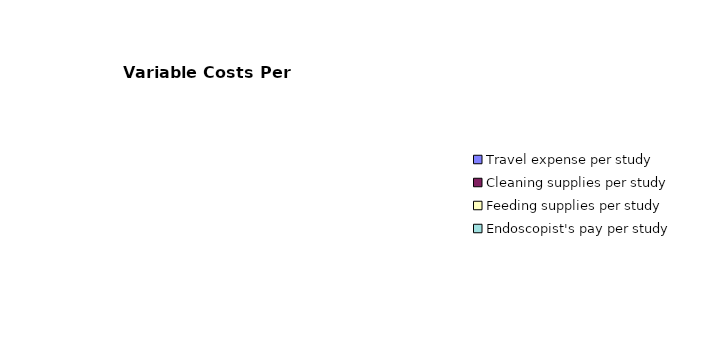
| Category | Series 0 |
|---|---|
| Travel expense per study | 0 |
| Cleaning supplies per study | 0 |
| Feeding supplies per study | 0 |
| Endoscopist's pay per study | 0 |